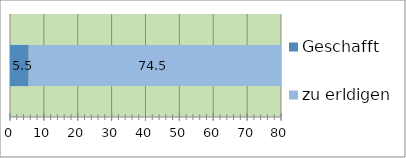
| Category | Geschafft | zu erldigen |
|---|---|---|
| 0 | 5.5 | 74.5 |